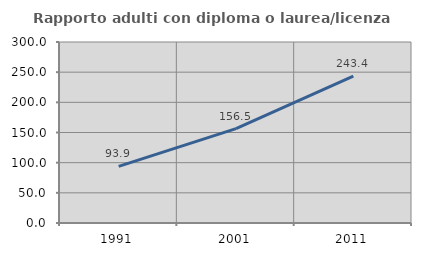
| Category | Rapporto adulti con diploma o laurea/licenza media  |
|---|---|
| 1991.0 | 93.855 |
| 2001.0 | 156.459 |
| 2011.0 | 243.426 |